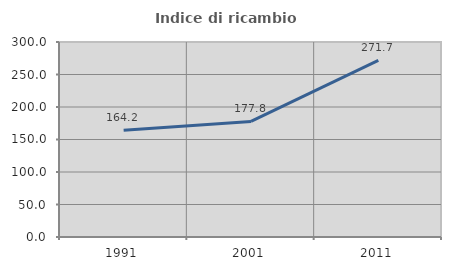
| Category | Indice di ricambio occupazionale  |
|---|---|
| 1991.0 | 164.179 |
| 2001.0 | 177.778 |
| 2011.0 | 271.739 |